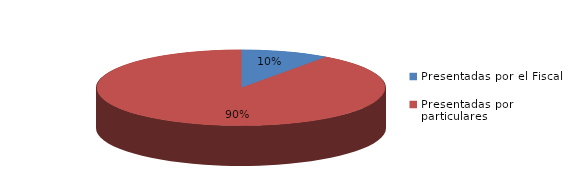
| Category | Series 0 |
|---|---|
| Presentadas por el Fiscal | 53 |
| Presentadas por particulares | 481 |